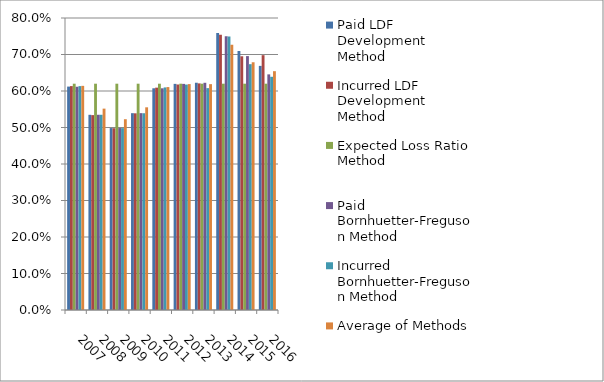
| Category | Paid LDF Development Method | Incurred LDF Development Method | Expected Loss Ratio Method | Paid Bornhuetter-Freguson Method | Incurred Bornhuetter-Freguson Method | Average of Methods |
|---|---|---|---|---|---|---|
| 2007.0 | 0.612 | 0.613 | 0.62 | 0.612 | 0.613 | 0.614 |
| 2008.0 | 0.535 | 0.534 | 0.62 | 0.535 | 0.535 | 0.552 |
| 2009.0 | 0.498 | 0.498 | 0.62 | 0.499 | 0.498 | 0.523 |
| 2010.0 | 0.539 | 0.539 | 0.62 | 0.539 | 0.539 | 0.555 |
| 2011.0 | 0.607 | 0.609 | 0.62 | 0.607 | 0.61 | 0.611 |
| 2012.0 | 0.62 | 0.618 | 0.62 | 0.619 | 0.618 | 0.619 |
| 2013.0 | 0.623 | 0.621 | 0.62 | 0.623 | 0.608 | 0.619 |
| 2014.0 | 0.759 | 0.754 | 0.62 | 0.75 | 0.749 | 0.726 |
| 2015.0 | 0.71 | 0.695 | 0.62 | 0.696 | 0.673 | 0.679 |
| 2016.0 | 0.669 | 0.698 | 0.62 | 0.646 | 0.639 | 0.654 |